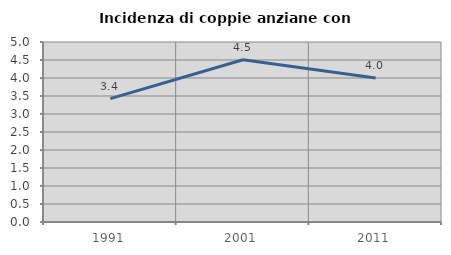
| Category | Incidenza di coppie anziane con figli |
|---|---|
| 1991.0 | 3.426 |
| 2001.0 | 4.507 |
| 2011.0 | 4 |